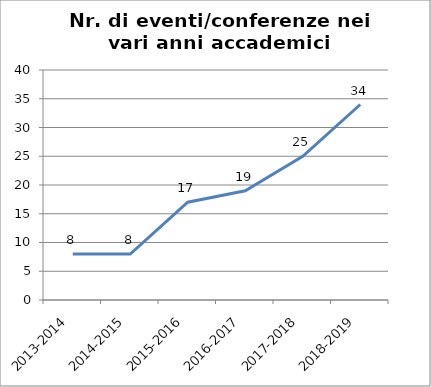
| Category | Nr. Eventi/Conferenze |
|---|---|
| 2013-2014 | 8 |
| 2014-2015 | 8 |
| 2015-2016 | 17 |
| 2016-2017 | 19 |
| 2017-2018 | 25 |
| 2018-2019 | 34 |